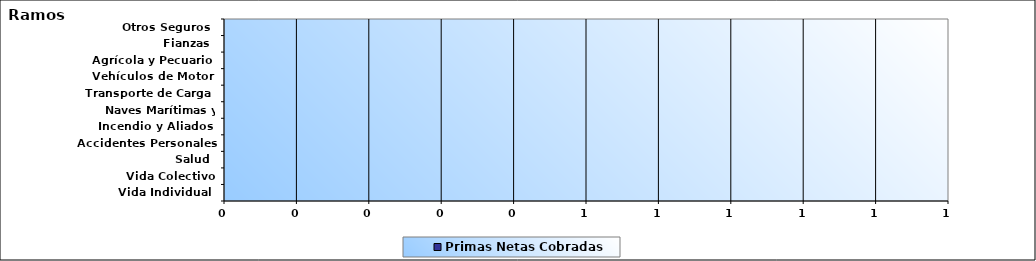
| Category | Primas Netas Cobradas |
|---|---|
| Vida Individual  | 0 |
| Vida Colectivo | 0 |
| Salud  | 0 |
| Accidentes Personales | 0 |
| Incendio y Aliados  | 0 |
| Naves Marítimas y Aéreas  | 0 |
| Transporte de Carga  | 0 |
| Vehículos de Motor  | 0 |
| Agrícola y Pecuario  | 0 |
| Fianzas  | 0 |
| Otros Seguros  | 0 |